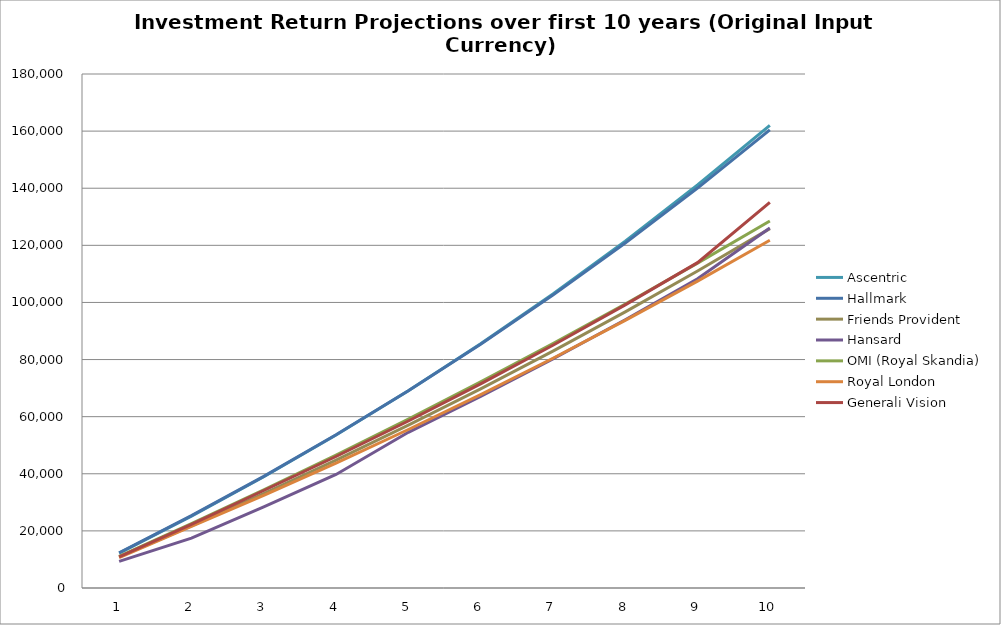
| Category | Ascentric | Hallmark | Friends Provident | Hansard | OMI (Royal Skandia) | Royal London | Generali Vision |
|---|---|---|---|---|---|---|---|
| 1.0 | 12224.659 | 12308.468 | 10911.168 | 9337.478 | 11091.076 | 10662.515 | 10906.853 |
| 2.0 | 25194.672 | 25326.145 | 21713.919 | 17481.701 | 22540.992 | 21621.212 | 22294.673 |
| 3.0 | 38958.229 | 39093.893 | 33023.315 | 28374.427 | 34361.358 | 32465.222 | 34142.399 |
| 4.0 | 53563.88 | 53654.933 | 44784.083 | 39768.19 | 46564.161 | 43756.12 | 46049.241 |
| 5.0 | 69063.148 | 69054.973 | 57013.712 | 54531.694 | 59161.773 | 55509.125 | 58481.147 |
| 6.0 | 85510.707 | 85342.356 | 69730.373 | 67101.998 | 72166.969 | 67740.061 | 71461.27 |
| 7.0 | 102964.576 | 102568.21 | 82952.948 | 80236.865 | 85592.934 | 80465.378 | 85013.786 |
| 8.0 | 121486.323 | 120786.61 | 96701.053 | 93957.829 | 99453.283 | 93702.177 | 99163.935 |
| 9.0 | 141141.286 | 140054.745 | 110995.074 | 108287.381 | 113762.07 | 107468.231 | 113938.073 |
| 10.0 | 161998.797 | 160433.101 | 125856.188 | 126099 | 128533.804 | 121782.007 | 135063.715 |